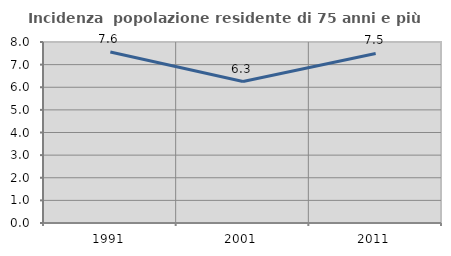
| Category | Incidenza  popolazione residente di 75 anni e più |
|---|---|
| 1991.0 | 7.561 |
| 2001.0 | 6.253 |
| 2011.0 | 7.492 |